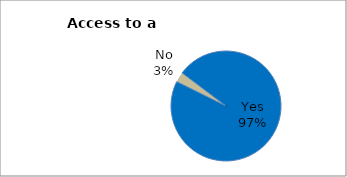
| Category | Series 0 |
|---|---|
| Yes | 97.029 |
| No | 2.971 |